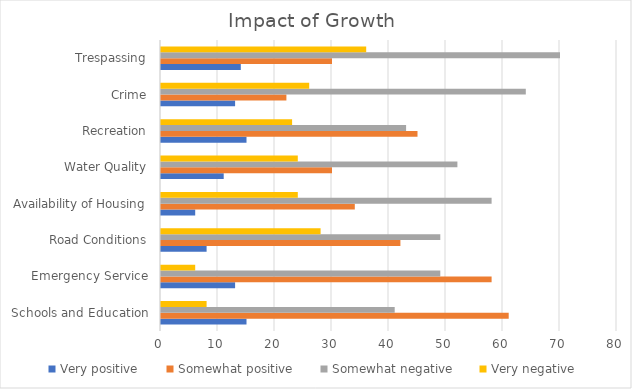
| Category | Very positive     | Somewhat positive     | Somewhat negative     | Very negative |
|---|---|---|---|---|
| Schools and Education | 15 | 61 | 41 | 8 |
| Emergency Service | 13 | 58 | 49 | 6 |
| Road Conditions | 8 | 42 | 49 | 28 |
| Availability of Housing | 6 | 34 | 58 | 24 |
| Water Quality | 11 | 30 | 52 | 24 |
| Recreation | 15 | 45 | 43 | 23 |
| Crime | 13 | 22 | 64 | 26 |
| Trespassing | 14 | 30 | 70 | 36 |